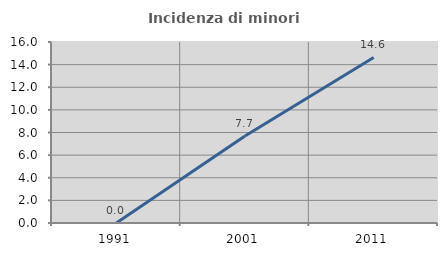
| Category | Incidenza di minori stranieri |
|---|---|
| 1991.0 | 0 |
| 2001.0 | 7.692 |
| 2011.0 | 14.634 |